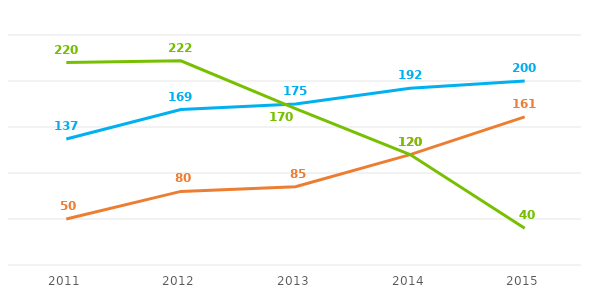
| Category | Inc Corp | Davis& Co | Pops Inc |
|---|---|---|---|
| 2011.0 | 137 | 50 | 220 |
| 2012.0 | 169 | 80 | 222 |
| 2013.0 | 175 | 85 | 170 |
| 2014.0 | 192 | 120 | 120 |
| 2015.0 | 200 | 161 | 40 |